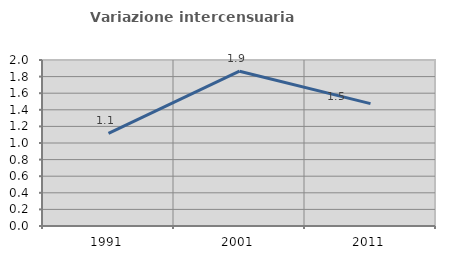
| Category | Variazione intercensuaria annua |
|---|---|
| 1991.0 | 1.115 |
| 2001.0 | 1.865 |
| 2011.0 | 1.474 |